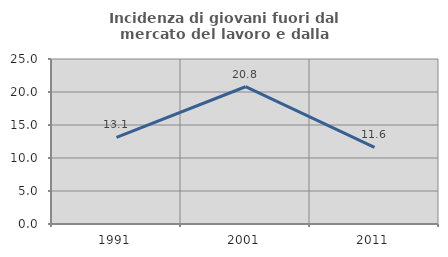
| Category | Incidenza di giovani fuori dal mercato del lavoro e dalla formazione  |
|---|---|
| 1991.0 | 13.123 |
| 2001.0 | 20.798 |
| 2011.0 | 11.625 |